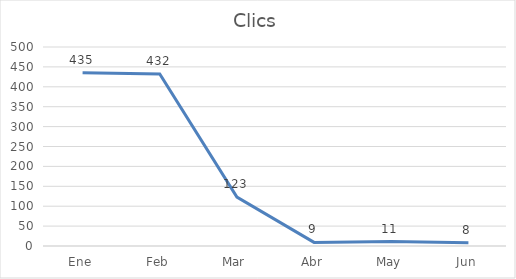
| Category | Clics |
|---|---|
| Ene | 435 |
| Feb | 432 |
| Mar | 123 |
| Abr | 9 |
| May | 11 |
| Jun | 8 |